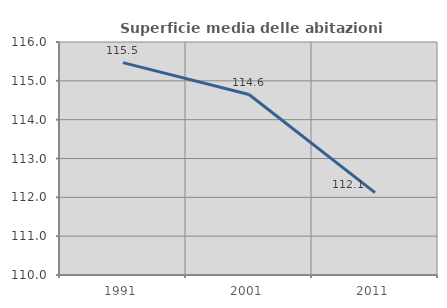
| Category | Superficie media delle abitazioni occupate |
|---|---|
| 1991.0 | 115.469 |
| 2001.0 | 114.647 |
| 2011.0 | 112.121 |